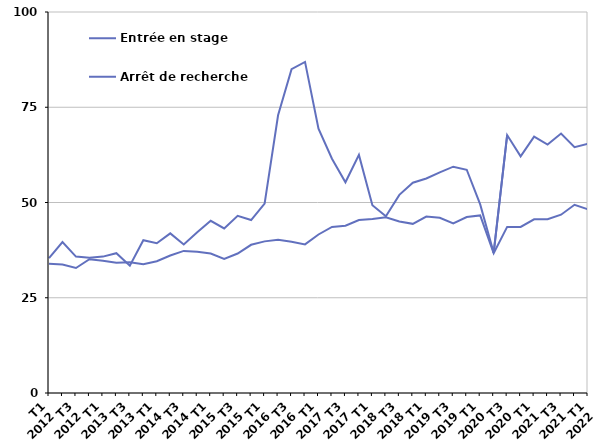
| Category | Entrée en stage | Arrêt de recherche |
|---|---|---|
| T1
2012 | 35.4 | 33.9 |
| T2
2012 | 39.6 | 33.7 |
| T3
2012 | 35.8 | 32.8 |
| T4
2012 | 35.5 | 35.1 |
| T1
2013 | 35.8 | 34.7 |
| T2
2013 | 36.7 | 34.2 |
| T3
2013 | 33.4 | 34.3 |
| T4
2013 | 40.1 | 33.8 |
| T1
2014 | 39.3 | 34.6 |
| T2
2014 | 41.9 | 36.1 |
| T3
2014 | 39 | 37.3 |
| T4
2014 | 42.2 | 37.1 |
| T1
2015 | 45.2 | 36.6 |
| T2
2015 | 43.2 | 35.2 |
| T3
2015 | 46.5 | 36.6 |
| T4
2015 | 45.4 | 38.9 |
| T1
2016 | 49.7 | 39.8 |
| T2
2016 | 72.9 | 40.2 |
| T3
2016 | 85 | 39.7 |
| T4
2016 | 86.9 | 39 |
| T1
2017 | 69.4 | 41.6 |
| T2
2017 | 61.5 | 43.6 |
| T3
2017 | 55.3 | 43.9 |
| T4
2017 | 62.5 | 45.4 |
| T1
2018 | 49.3 | 45.7 |
| T2
2018 | 46.4 | 46.1 |
| T3
2018 | 52 | 45 |
| T4
2018 | 55.2 | 44.4 |
| T1
2019 | 56.3 | 46.3 |
| T2
2019 | 57.9 | 46 |
| T3
2019 | 59.4 | 44.5 |
| T4
2019 | 58.6 | 46.2 |
| T1
2020 | 49.5 | 46.6 |
| T2
2020 | 36.8 | 36.7 |
| T3
2020 | 67.7 | 43.6 |
| T4
2020 | 62.1 | 43.6 |
| T1
2021 | 67.3 | 45.6 |
| T2
2021 | 65.2 | 45.6 |
| T3
2021 | 68.1 | 46.8 |
| T4
2021 | 64.5 | 49.4 |
| T1
2022 | 65.4 | 48.2 |